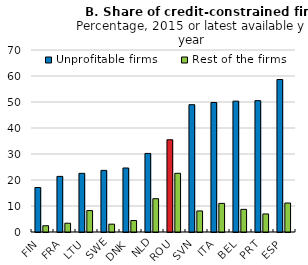
| Category | Unprofitable firms | Rest of the firms |
|---|---|---|
| FIN | 17.112 | 2.408 |
| FRA | 21.392 | 3.378 |
| LTU | 22.566 | 8.236 |
| SWE | 23.698 | 3.012 |
| DNK | 24.618 | 4.416 |
| NLD | 30.216 | 12.806 |
| ROU | 35.478 | 22.574 |
| SVN | 48.971 | 8.096 |
| ITA | 49.816 | 11.004 |
| BEL | 50.331 | 8.709 |
| PRT | 50.517 | 6.938 |
| ESP | 58.643 | 11.141 |